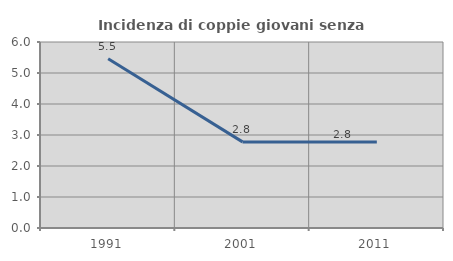
| Category | Incidenza di coppie giovani senza figli |
|---|---|
| 1991.0 | 5.462 |
| 2001.0 | 2.778 |
| 2011.0 | 2.778 |